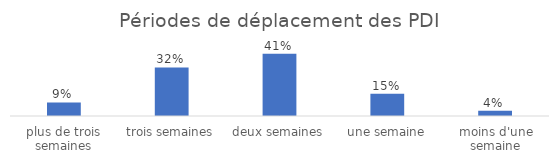
| Category | Total |
|---|---|
| plus de trois semaines | 0.089 |
| trois semaines | 0.32 |
| deux semaines | 0.409 |
| une semaine | 0.147 |
| moins d'une semaine | 0.035 |